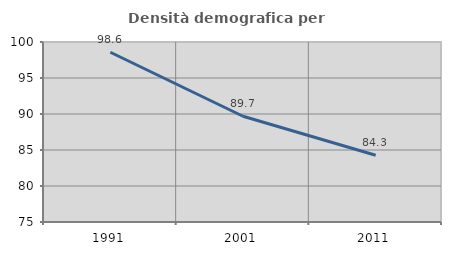
| Category | Densità demografica |
|---|---|
| 1991.0 | 98.579 |
| 2001.0 | 89.685 |
| 2011.0 | 84.269 |